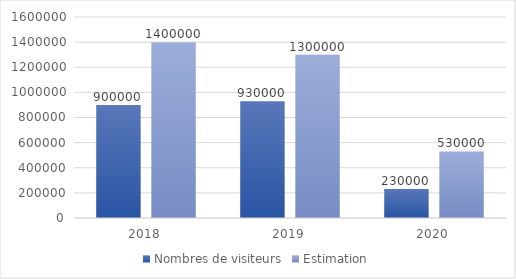
| Category | Nombres de visiteurs | Estimation |
|---|---|---|
| 2018.0 | 900000 | 1400000 |
| 2019.0 | 930000 | 1300000 |
| 2020.0 | 230000 | 530000 |